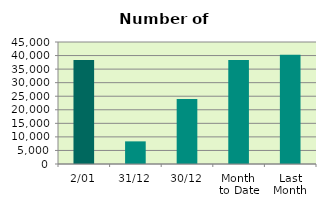
| Category | Series 0 |
|---|---|
| 2/01 | 38402 |
| 31/12 | 8348 |
| 30/12 | 23968 |
| Month 
to Date | 38402 |
| Last
Month | 40313.8 |